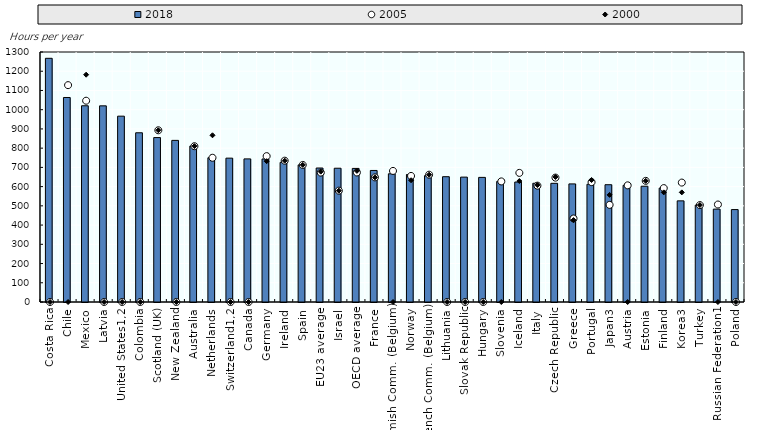
| Category | 2018 |
|---|---|
| Costa Rica | 1267.2 |
| Chile | 1063.473 |
| Mexico | 1020.5 |
| Latvia | 1020 |
| United States1,2 | 966.363 |
| Colombia | 880 |
| Scotland (UK) | 855 |
| New Zealand | 840.4 |
| Australia | 810.793 |
| Netherlands | 750 |
| Switzerland1,2 | 748 |
| Canada | 744.225 |
| Germany | 743.769 |
| Ireland | 726 |
| Spain | 712.8 |
| EU23 average | 696.776 |
| Israel | 695.658 |
| OECD average | 694.615 |
| France | 684 |
| Flemish Comm. (Belgium) | 666.667 |
| Norway | 663.1 |
| French Comm. (Belgium) | 656.93 |
| Lithuania | 651.6 |
| Slovak Republic | 649.4 |
| Hungary | 648 |
| Slovenia | 627 |
| Iceland | 623.88 |
| Italy | 617.4 |
| Czech Republic | 617.1 |
| Greece | 614.1 |
| Portugal | 612.333 |
| Japan3 | 609.897 |
| Austria | 606.6 |
| Estonia | 602 |
| Finland | 592.2 |
| Korea3 | 525.951 |
| Turkey | 504 |
| Russian Federation1 | 483 |
| Poland | 480.6 |